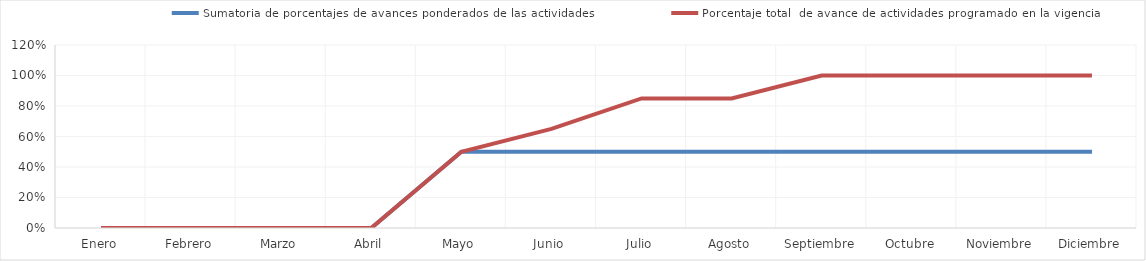
| Category | Sumatoria de porcentajes de avances ponderados de las actividades | Porcentaje total  de avance de actividades programado en la vigencia |
|---|---|---|
| 0 | 0 | 0 |
| 1 | 0 | 0 |
| 2 | 0 | 0 |
| 3 | 0 | 0 |
| 4 | 0.5 | 0.5 |
| 5 | 0.5 | 0.65 |
| 6 | 0.5 | 0.85 |
| 7 | 0.5 | 0.85 |
| 8 | 0.5 | 1 |
| 9 | 0.5 | 1 |
| 10 | 0.5 | 1 |
| 11 | 0.5 | 1 |